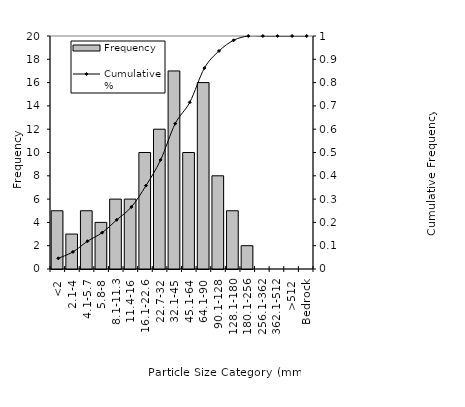
| Category | Frequency |
|---|---|
| <2 | 5 |
| 2.1-4 | 3 |
| 4.1-5.7 | 5 |
| 5.8-8 | 4 |
| 8.1-11.3 | 6 |
| 11.4-16 | 6 |
| 16.1-22.6 | 10 |
| 22.7-32 | 12 |
| 32.1-45 | 17 |
| 45.1-64 | 10 |
| 64.1-90 | 16 |
| 90.1-128 | 8 |
| 128.1-180 | 5 |
| 180.1-256 | 2 |
| 256.1-362 | 0 |
| 362.1-512 | 0 |
| >512 | 0 |
| Bedrock | 0 |